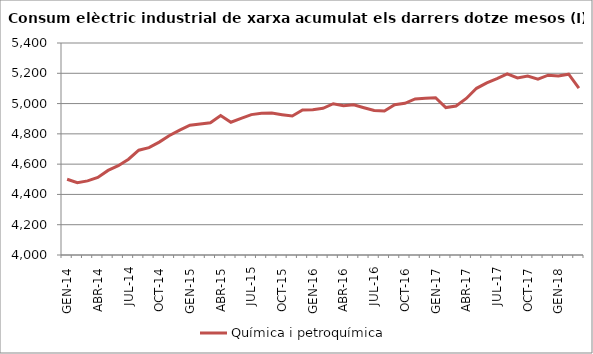
| Category | Química i petroquímica |
|---|---|
| GEN-14 | 4500.056 |
| FEB-14 | 4477.744 |
| MAR-14 | 4489.421 |
| ABR-14 | 4512.52 |
| MAI-14 | 4558.636 |
| JUN-14 | 4589.802 |
| JUL-14 | 4632.609 |
| AGO-14 | 4692.124 |
| SET-14 | 4709.297 |
| OCT-14 | 4745.52 |
| NOV-14 | 4789.386 |
| DES-14 | 4824.806 |
| GEN-15 | 4857.477 |
| FEB-15 | 4865.81 |
| MAR-15 | 4873.152 |
| ABR-15 | 4921.46 |
| MAI-15 | 4876.584 |
| JUN-15 | 4901.658 |
| JUL-15 | 4927.213 |
| AGO-15 | 4935.499 |
| SET-15 | 4936.899 |
| OCT-15 | 4926.748 |
| NOV-15 | 4917.693 |
| DES-15 | 4957.643 |
| GEN-16 | 4959.752 |
| FEB-16 | 4968.656 |
| MAR-16 | 4998.819 |
| ABR-16 | 4985.006 |
| MAI-16 | 4991.746 |
| JUN-16 | 4972.781 |
| JUL-16 | 4954.038 |
| AGO-16 | 4951.268 |
| SET-16 | 4991.817 |
| OCT-16 | 5001.772 |
| NOV-16 | 5030.671 |
| DES-16 | 5034.643 |
| GEN-17 | 5038.342 |
| FEB-17 | 4973.745 |
| MAR-17 | 4984.25 |
| ABR-17 | 5033.758 |
| MAI-17 | 5100.828 |
| JUN-17 | 5136.805 |
| JUL-17 | 5164.856 |
| AGO-17 | 5196.33 |
| SET-17 | 5169.736 |
| OCT-17 | 5181.428 |
| NOV-17 | 5161.325 |
| DES-17 | 5187.649 |
| GEN-18 | 5181.516 |
| FEB-18 | 5194.038 |
| MAR-18 | 5102.565 |